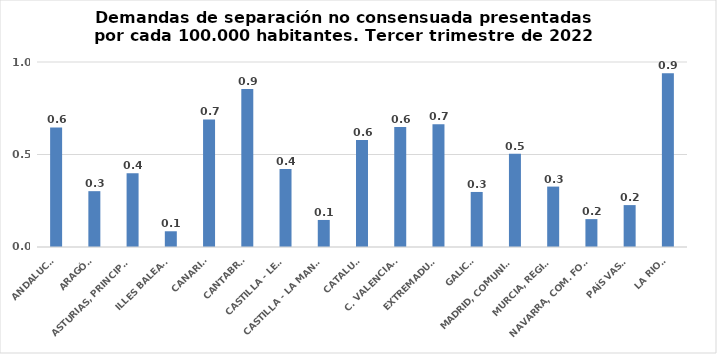
| Category | Series 0 |
|---|---|
| ANDALUCÍA | 0.647 |
| ARAGÓN | 0.302 |
| ASTURIAS, PRINCIPADO | 0.398 |
| ILLES BALEARS | 0.085 |
| CANARIAS | 0.689 |
| CANTABRIA | 0.854 |
| CASTILLA - LEÓN | 0.422 |
| CASTILLA - LA MANCHA | 0.146 |
| CATALUÑA | 0.578 |
| C. VALENCIANA | 0.648 |
| EXTREMADURA | 0.664 |
| GALICIA | 0.297 |
| MADRID, COMUNIDAD | 0.504 |
| MURCIA, REGIÓN | 0.326 |
| NAVARRA, COM. FORAL | 0.151 |
| PAÍS VASCO | 0.227 |
| LA RIOJA | 0.939 |